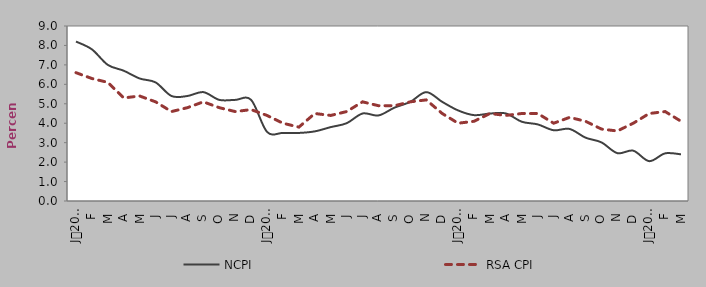
| Category | NCPI | RSA CPI |
|---|---|---|
| 0 | 8.2 | 6.6 |
| 1900-01-01 | 7.8 | 6.3 |
| 1900-01-02 | 7 | 6.1 |
| 1900-01-03 | 6.7 | 5.3 |
| 1900-01-04 | 6.3 | 5.4 |
| 1900-01-05 | 6.1 | 5.1 |
| 1900-01-06 | 5.4 | 4.6 |
| 1900-01-07 | 5.4 | 4.8 |
| 1900-01-08 | 5.6 | 5.1 |
| 1900-01-09 | 5.2 | 4.8 |
| 1900-01-10 | 5.2 | 4.6 |
| 1900-01-11 | 5.2 | 4.7 |
| 1900-01-12 | 3.555 | 4.4 |
| 1900-01-13 | 3.5 | 4 |
| 1900-01-14 | 3.5 | 3.8 |
| 1900-01-15 | 3.581 | 4.5 |
| 1900-01-16 | 3.8 | 4.4 |
| 1900-01-17 | 4 | 4.6 |
| 1900-01-18 | 4.5 | 5.1 |
| 1900-01-19 | 4.4 | 4.9 |
| 1900-01-20 | 4.8 | 4.9 |
| 1900-01-21 | 5.1 | 5.1 |
| 1900-01-22 | 5.6 | 5.2 |
| 1900-01-23 | 5.1 | 4.5 |
| 1900-01-24 | 4.658 | 4 |
| 1900-01-25 | 4.416 | 4.1 |
| 1900-01-26 | 4.498 | 4.5 |
| 1900-01-27 | 4.503 | 4.4 |
| 1900-01-28 | 4.076 | 4.5 |
| 1900-01-29 | 3.939 | 4.5 |
| 1900-01-30 | 3.639 | 4 |
| 1900-01-31 | 3.705 | 4.3 |
| 1900-02-01 | 3.259 | 4.1 |
| 1900-02-02 | 3.015 | 3.7 |
| 1900-02-03 | 2.461 | 3.6 |
| 1900-02-04 | 2.588 | 4 |
| 1900-02-05 | 2.05 | 4.5 |
| 1900-02-06 | 2.45 | 4.6 |
| 1900-02-07 | 2.4 | 4.1 |